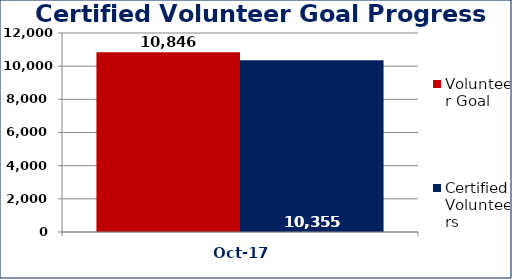
| Category | Volunteer Goal  | Certified Volunteers  |
|---|---|---|
| Oct-17 | 10846 | 10355 |